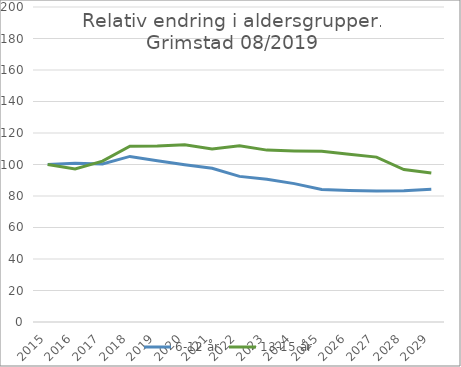
| Category | 6-12 år | 13-15 år |
|---|---|---|
| 2015.0 | 100 | 100 |
| 2016.0 | 100.852 | 97.118 |
| 2017.0 | 100.331 | 102.146 |
| 2018.0 | 105.135 | 111.649 |
| 2019.0 | 102.411 | 111.713 |
| 2020.0 | 99.878 | 112.486 |
| 2021.0 | 97.601 | 109.913 |
| 2022.0 | 92.446 | 111.937 |
| 2023.0 | 90.578 | 109.131 |
| 2024.0 | 87.849 | 108.585 |
| 2025.0 | 84.185 | 108.382 |
| 2026.0 | 83.543 | 106.501 |
| 2027.0 | 83.099 | 104.688 |
| 2028.0 | 83.389 | 96.827 |
| 2029.0 | 84.252 | 94.549 |